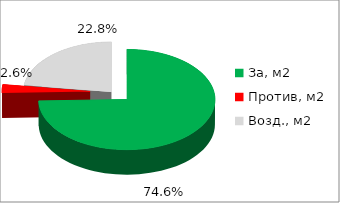
| Category | Series 0 |
|---|---|
| За, м2 | 0.746 |
| Против, м2 | 0.026 |
| Возд., м2 | 0.228 |